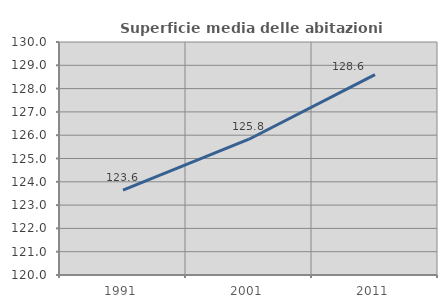
| Category | Superficie media delle abitazioni occupate |
|---|---|
| 1991.0 | 123.641 |
| 2001.0 | 125.827 |
| 2011.0 | 128.596 |